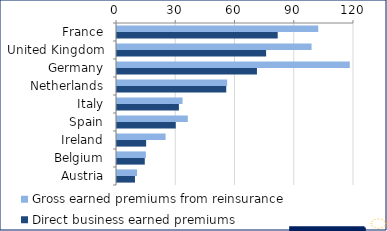
| Category | Gross earned premiums from reinsurance | Direct business earned premiums |
|---|---|---|
| France | 101.894 | 81.371 |
| United Kingdom | 98.505 | 75.499 |
| Germany | 117.871 | 70.861 |
| Netherlands | 55.792 | 55.313 |
| Italy | 33.179 | 31.346 |
| Spain | 35.845 | 29.746 |
| Ireland | 24.603 | 14.751 |
| Belgium | 14.622 | 14.072 |
| Austria | 10.164 | 9.095 |